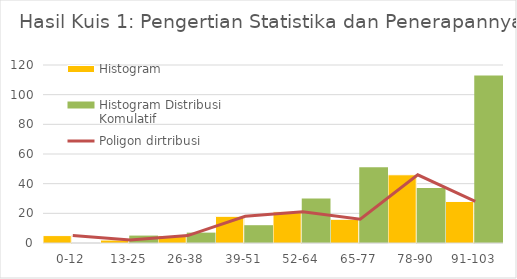
| Category | Histogram | Histogram Distribusi Komulatif |
|---|---|---|
| 0-12 | 5 | 0 |
| 13-25 | 2 | 5 |
| 26-38 | 5 | 7 |
| 39-51 | 18 | 12 |
| 52-64 | 21 | 30 |
| 65-77 | 16 | 51 |
| 78-90 | 46 | 37 |
| 91-103 | 28 | 113 |